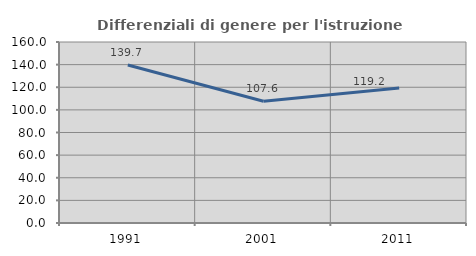
| Category | Differenziali di genere per l'istruzione superiore |
|---|---|
| 1991.0 | 139.671 |
| 2001.0 | 107.629 |
| 2011.0 | 119.233 |